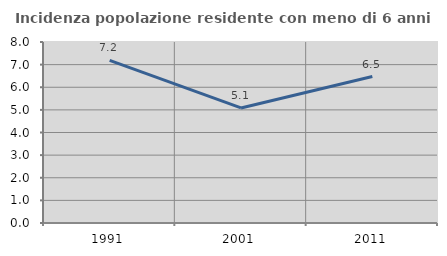
| Category | Incidenza popolazione residente con meno di 6 anni |
|---|---|
| 1991.0 | 7.184 |
| 2001.0 | 5.086 |
| 2011.0 | 6.475 |